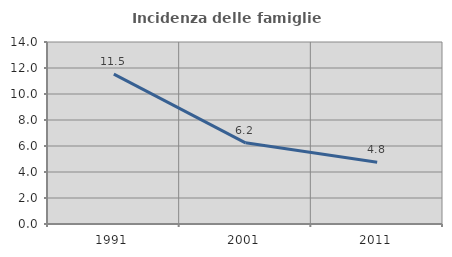
| Category | Incidenza delle famiglie numerose |
|---|---|
| 1991.0 | 11.529 |
| 2001.0 | 6.245 |
| 2011.0 | 4.752 |